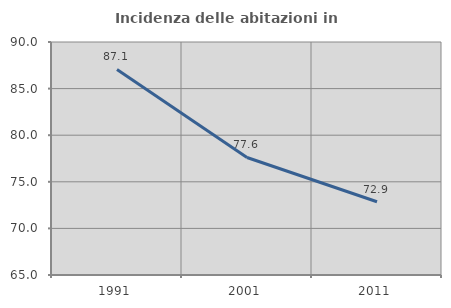
| Category | Incidenza delle abitazioni in proprietà  |
|---|---|
| 1991.0 | 87.05 |
| 2001.0 | 77.612 |
| 2011.0 | 72.862 |